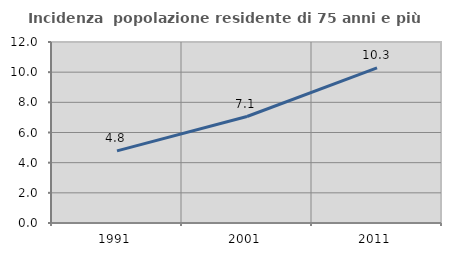
| Category | Incidenza  popolazione residente di 75 anni e più |
|---|---|
| 1991.0 | 4.779 |
| 2001.0 | 7.059 |
| 2011.0 | 10.29 |